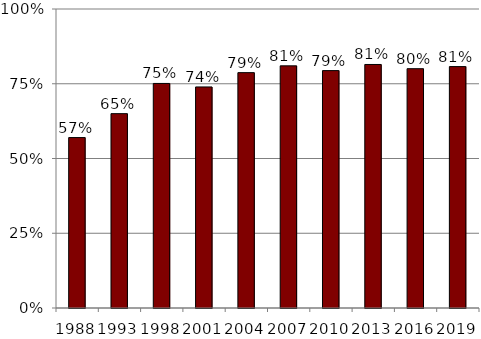
| Category | Eligible participating |
|---|---|
| 1988.0 | 0.57 |
| 1993.0 | 0.65 |
| 1998.0 | 0.751 |
| 2001.0 | 0.739 |
| 2004.0 | 0.787 |
| 2007.0 | 0.81 |
| 2010.0 | 0.794 |
| 2013.0 | 0.814 |
| 2016.0 | 0.8 |
| 2019.0 | 0.807 |